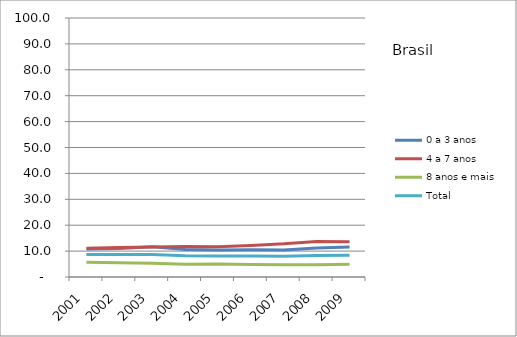
| Category | 0 a 3 anos | 4 a 7 anos | 8 anos e mais | Total |
|---|---|---|---|---|
| 2001.0 | 10.8 | 11.1 | 5.7 | 8.7 |
| 2002.0 | 11 | 11.4 | 5.5 | 8.7 |
| 2003.0 | 11.7 | 11.6 | 5.3 | 8.7 |
| 2004.0 | 10.6 | 11.8 | 4.9 | 8.2 |
| 2005.0 | 10.4 | 11.7 | 5 | 8.1 |
| 2006.0 | 10.5 | 12.2 | 4.8 | 8.1 |
| 2007.0 | 10.4 | 12.8 | 4.7 | 8 |
| 2008.0 | 11.2 | 13.7 | 4.7 | 8.3 |
| 2009.0 | 11.6 | 13.6 | 4.9 | 8.4 |